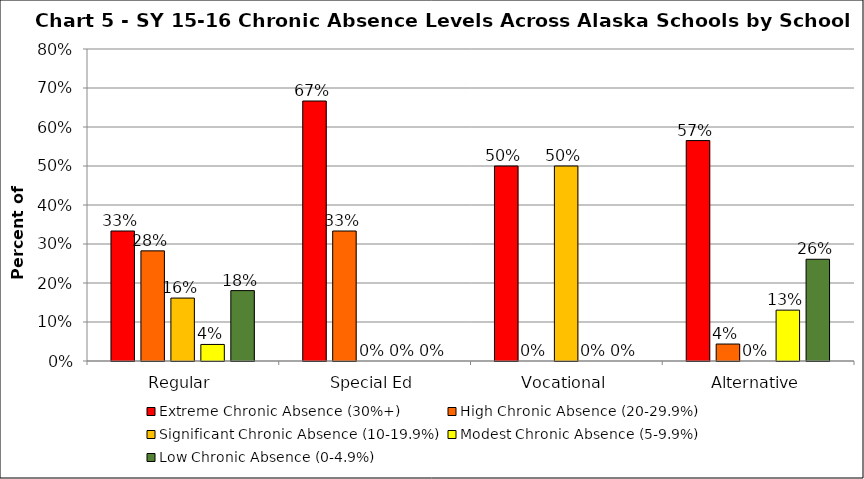
| Category | Extreme Chronic Absence (30%+) | High Chronic Absence (20-29.9%) | Significant Chronic Absence (10-19.9%) | Modest Chronic Absence (5-9.9%) | Low Chronic Absence (0-4.9%) |
|---|---|---|---|---|---|
| 0 | 0.333 | 0.282 | 0.161 | 0.042 | 0.18 |
| 1 | 0.667 | 0.333 | 0 | 0 | 0 |
| 2 | 0.5 | 0 | 0.5 | 0 | 0 |
| 3 | 0.565 | 0.043 | 0 | 0.13 | 0.261 |